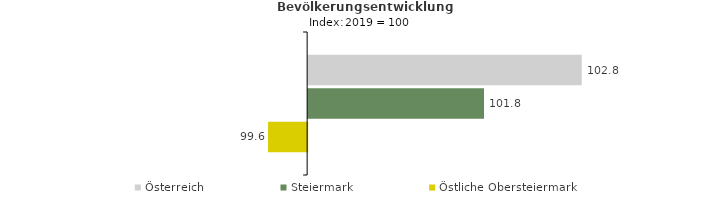
| Category | Österreich | Steiermark | Östliche Obersteiermark |
|---|---|---|---|
| 2023.0 | 102.8 | 101.8 | 99.6 |